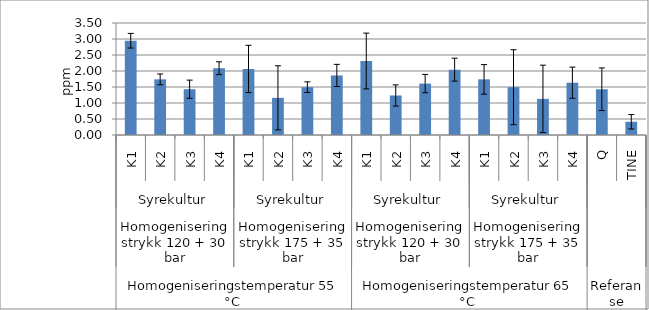
| Category | Diacetyl |
|---|---|
| 0 | 2.946 |
| 1 | 1.739 |
| 2 | 1.431 |
| 3 | 2.087 |
| 4 | 2.064 |
| 5 | 1.161 |
| 6 | 1.494 |
| 7 | 1.861 |
| 8 | 2.312 |
| 9 | 1.235 |
| 10 | 1.607 |
| 11 | 2.042 |
| 12 | 1.739 |
| 13 | 1.493 |
| 14 | 1.13 |
| 15 | 1.635 |
| 16 | 1.43 |
| 17 | 0.413 |